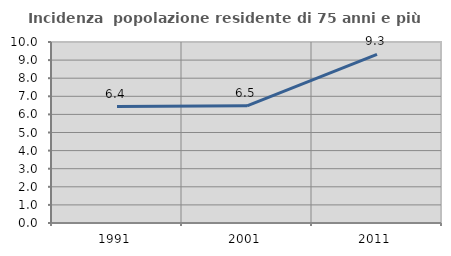
| Category | Incidenza  popolazione residente di 75 anni e più |
|---|---|
| 1991.0 | 6.43 |
| 2001.0 | 6.474 |
| 2011.0 | 9.313 |